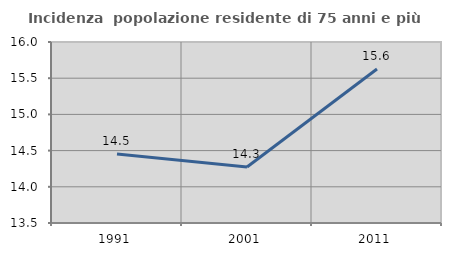
| Category | Incidenza  popolazione residente di 75 anni e più |
|---|---|
| 1991.0 | 14.454 |
| 2001.0 | 14.274 |
| 2011.0 | 15.628 |